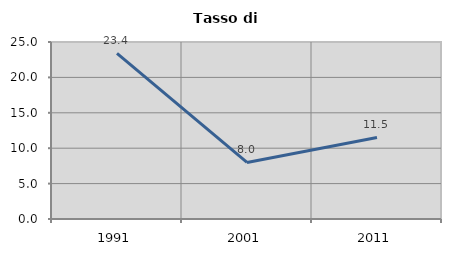
| Category | Tasso di disoccupazione   |
|---|---|
| 1991.0 | 23.38 |
| 2001.0 | 7.985 |
| 2011.0 | 11.514 |